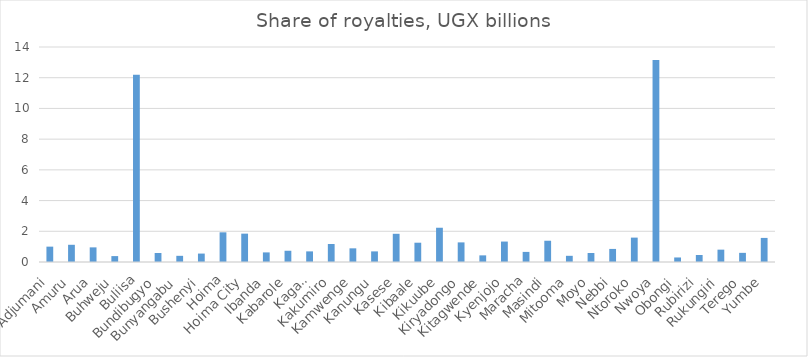
| Category | Series 0 |
|---|---|
| Adjumani | 1 |
| Amuru | 1.121 |
| Arua | 0.953 |
| Buhweju | 0.384 |
| Buliisa | 12.197 |
| Bundibugyo | 0.586 |
| Bunyangabu | 0.402 |
| Bushenyi | 0.549 |
| Hoima | 1.933 |
| Hoima City | 1.846 |
| Ibanda | 0.625 |
| Kabarole | 0.732 |
| Kagadi | 0.692 |
| Kakumiro | 1.17 |
| Kamwenge | 0.89 |
| Kanungu | 0.691 |
| Kasese | 1.837 |
| Kibaale | 1.256 |
| Kikuube | 2.231 |
| Kiryadongo | 1.277 |
| Kitagwende | 0.432 |
| Kyenjojo | 1.331 |
| Maracha | 0.657 |
| Masindi | 1.384 |
| Mitooma | 0.403 |
| Moyo | 0.585 |
| Nebbi | 0.852 |
| Ntoroko | 1.588 |
| Nwoya | 13.146 |
| Obongi | 0.295 |
| Rubirizi | 0.456 |
| Rukungiri | 0.804 |
| Terego | 0.596 |
| Yumbe | 1.568 |